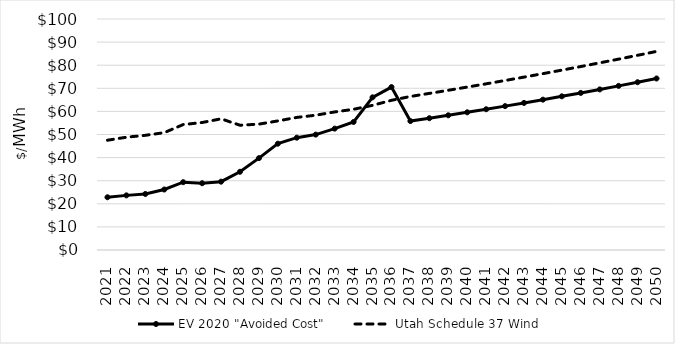
| Category | EV 2020 "Avoided Cost" | Utah Schedule 37 Wind |
|---|---|---|
| 2021.0 | 22.832 | 47.516 |
| 2022.0 | 23.649 | 48.829 |
| 2023.0 | 24.257 | 49.646 |
| 2024.0 | 26.185 | 50.805 |
| 2025.0 | 29.358 | 54.302 |
| 2026.0 | 28.912 | 55.188 |
| 2027.0 | 29.581 | 56.785 |
| 2028.0 | 33.861 | 54.016 |
| 2029.0 | 39.764 | 54.484 |
| 2030.0 | 46.027 | 55.878 |
| 2031.0 | 48.627 | 57.396 |
| 2032.0 | 49.954 | 58.353 |
| 2033.0 | 52.542 | 59.771 |
| 2034.0 | 55.427 | 60.916 |
| 2035.0 | 66.094 | 62.623 |
| 2036.0 | 70.535 | 64.793 |
| 2037.0 | 55.811 | 66.461 |
| 2038.0 | 57.05 | 67.79 |
| 2039.0 | 58.316 | 69.146 |
| 2040.0 | 59.611 | 70.529 |
| 2041.0 | 60.934 | 71.939 |
| 2042.0 | 62.287 | 73.378 |
| 2043.0 | 63.67 | 74.846 |
| 2044.0 | 65.083 | 76.343 |
| 2045.0 | 66.528 | 77.869 |
| 2046.0 | 68.005 | 79.427 |
| 2047.0 | 69.515 | 81.015 |
| 2048.0 | 71.058 | 82.636 |
| 2049.0 | 72.635 | 84.288 |
| 2050.0 | 74.248 | 85.974 |